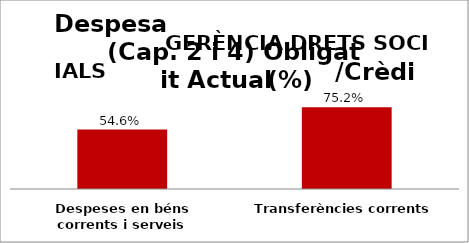
| Category | Series 0 |
|---|---|
| Despeses en béns corrents i serveis | 0.546 |
| Transferències corrents | 0.752 |